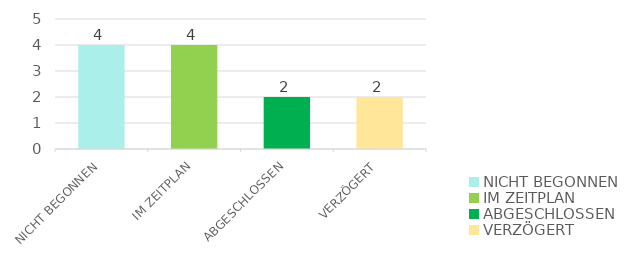
| Category | Series 0 |
|---|---|
| NICHT BEGONNEN | 4 |
| IM ZEITPLAN | 4 |
| ABGESCHLOSSEN | 2 |
| VERZÖGERT | 2 |